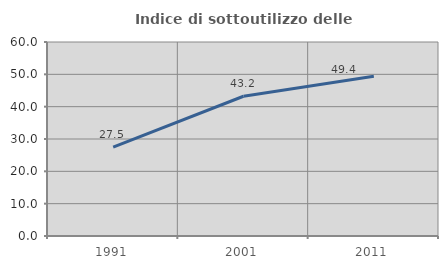
| Category | Indice di sottoutilizzo delle abitazioni  |
|---|---|
| 1991.0 | 27.517 |
| 2001.0 | 43.226 |
| 2011.0 | 49.438 |